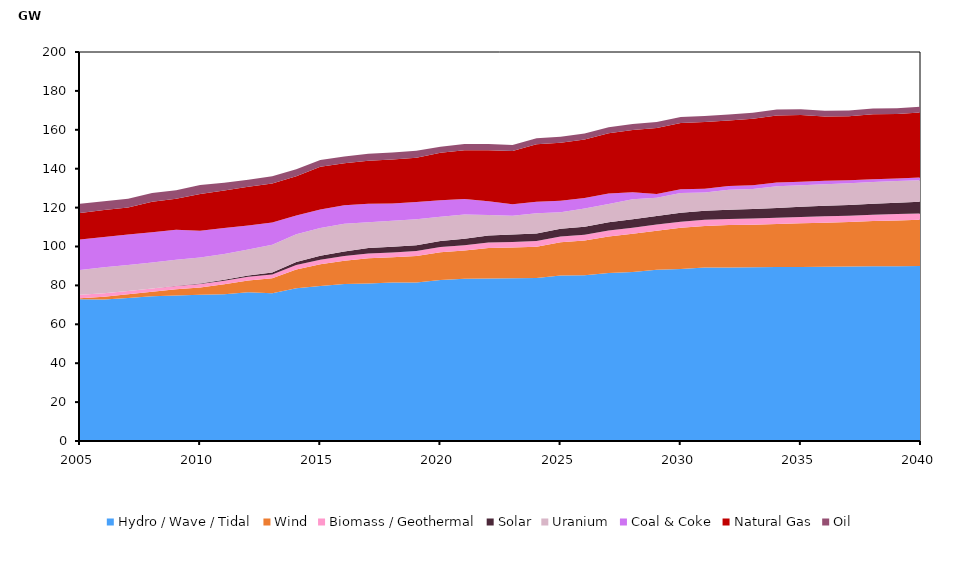
| Category | Hydro / Wave / Tidal | Wind | Biomass / Geothermal | Solar | Uranium | Coal & Coke | Natural Gas | Oil |
|---|---|---|---|---|---|---|---|---|
| 2005.0 | 72.878 | 0.557 | 1.708 | 0.017 | 12.805 | 15.648 | 13.561 | 4.77 |
| 2006.0 | 72.768 | 1.443 | 1.715 | 0.02 | 13.345 | 15.564 | 13.859 | 4.519 |
| 2007.0 | 73.569 | 1.823 | 1.715 | 0.026 | 13.345 | 15.651 | 13.955 | 4.524 |
| 2008.0 | 74.472 | 2.321 | 1.639 | 0.033 | 13.345 | 15.472 | 15.717 | 4.521 |
| 2009.0 | 74.754 | 3.24 | 1.708 | 0.095 | 13.345 | 15.529 | 15.82 | 4.475 |
| 2010.0 | 75.149 | 3.746 | 1.773 | 0.281 | 13.345 | 13.78 | 18.945 | 4.609 |
| 2011.0 | 75.465 | 5.171 | 1.802 | 0.419 | 13.345 | 13.254 | 19.355 | 3.916 |
| 2012.0 | 76.52 | 6.038 | 1.858 | 0.647 | 13.345 | 12.42 | 19.891 | 3.641 |
| 2013.0 | 75.991 | 7.684 | 1.886 | 1.028 | 14.345 | 11.446 | 20.066 | 3.645 |
| 2014.0 | 78.565 | 9.622 | 2.342 | 1.523 | 14.273 | 9.615 | 20.153 | 3.656 |
| 2015.0 | 79.677 | 11.162 | 2.318 | 2.135 | 14.273 | 9.491 | 21.931 | 3.501 |
| 2016.0 | 80.728 | 11.983 | 2.385 | 2.307 | 14.273 | 9.491 | 21.577 | 3.559 |
| 2017.0 | 81.012 | 12.89 | 2.465 | 2.805 | 13.338 | 9.491 | 22.097 | 3.595 |
| 2018.0 | 81.474 | 12.998 | 2.477 | 2.926 | 13.338 | 8.903 | 22.576 | 3.615 |
| 2019.0 | 81.524 | 13.623 | 2.519 | 3.011 | 13.338 | 8.903 | 22.737 | 3.625 |
| 2020.0 | 82.811 | 14.192 | 2.726 | 3.073 | 12.513 | 8.495 | 24.402 | 3.135 |
| 2021.0 | 83.456 | 14.432 | 2.789 | 3.248 | 12.513 | 7.95 | 25.132 | 3.135 |
| 2022.0 | 83.516 | 15.686 | 2.824 | 3.688 | 10.498 | 7.005 | 26.292 | 3.135 |
| 2023.0 | 83.667 | 15.782 | 2.919 | 3.777 | 9.673 | 5.853 | 27.372 | 3.091 |
| 2024.0 | 83.814 | 16.034 | 2.925 | 3.873 | 10.498 | 5.853 | 29.521 | 3.105 |
| 2025.0 | 85.077 | 17.093 | 2.972 | 4.029 | 8.451 | 5.853 | 29.807 | 3.102 |
| 2026.0 | 85.208 | 17.842 | 3.008 | 4.146 | 9.386 | 5.404 | 30.065 | 3.07 |
| 2027.0 | 86.415 | 18.715 | 3.054 | 4.233 | 9.389 | 5.404 | 31.035 | 3.07 |
| 2028.0 | 86.939 | 19.642 | 3.109 | 4.318 | 10.229 | 3.634 | 31.975 | 3.074 |
| 2029.0 | 88.037 | 20.098 | 3.124 | 4.43 | 9.407 | 1.951 | 33.88 | 3.043 |
| 2030.0 | 88.487 | 21.139 | 3.147 | 4.523 | 10.247 | 1.951 | 34.03 | 3.048 |
| 2031.0 | 89.181 | 21.413 | 3.153 | 4.625 | 9.425 | 1.951 | 34.24 | 3.053 |
| 2032.0 | 89.256 | 21.744 | 3.158 | 4.751 | 10.265 | 1.951 | 33.655 | 3.057 |
| 2033.0 | 89.341 | 21.89 | 3.214 | 4.867 | 10.265 | 1.951 | 34.137 | 3.057 |
| 2034.0 | 89.396 | 22.225 | 3.224 | 4.989 | 11.105 | 1.951 | 34.488 | 3.057 |
| 2035.0 | 89.491 | 22.463 | 3.23 | 5.227 | 11.105 | 1.795 | 34.32 | 2.99 |
| 2036.0 | 89.545 | 22.713 | 3.236 | 5.413 | 11.105 | 1.795 | 33.023 | 2.994 |
| 2037.0 | 89.698 | 22.865 | 3.243 | 5.59 | 11.105 | 1.519 | 32.968 | 2.994 |
| 2038.0 | 89.787 | 23.291 | 3.257 | 5.671 | 11.105 | 1.519 | 33.378 | 2.994 |
| 2039.0 | 89.88 | 23.551 | 3.264 | 5.846 | 11.105 | 1.364 | 33.058 | 2.994 |
| 2040.0 | 89.915 | 23.813 | 3.271 | 6.021 | 11.105 | 1.364 | 33.428 | 2.994 |